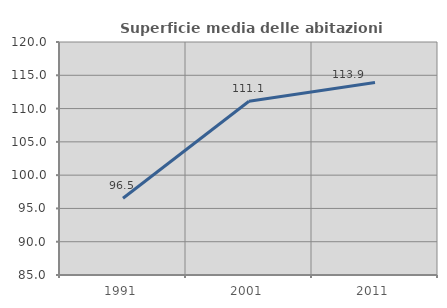
| Category | Superficie media delle abitazioni occupate |
|---|---|
| 1991.0 | 96.533 |
| 2001.0 | 111.107 |
| 2011.0 | 113.914 |